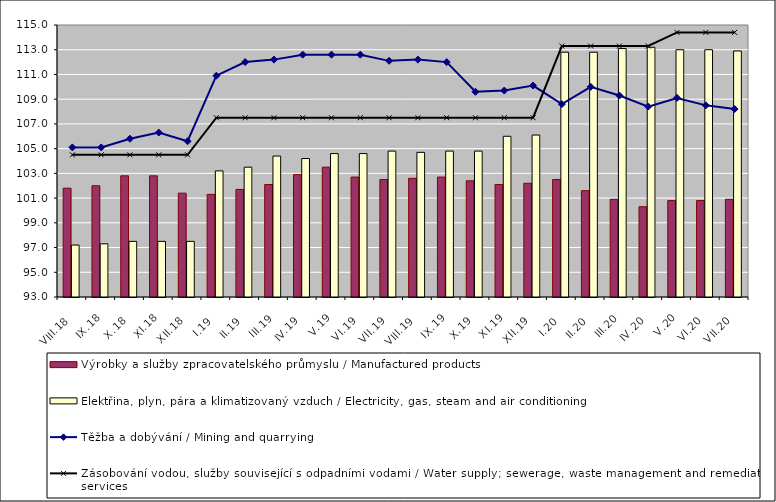
| Category | Výrobky a služby zpracovatelského průmyslu / Manufactured products | Elektřina, plyn, pára a klimatizovaný vzduch / Electricity, gas, steam and air conditioning |
|---|---|---|
| VIII.18 | 101.8 | 97.2 |
| IX.18 | 102 | 97.3 |
| X.18 | 102.8 | 97.5 |
| XI.18 | 102.8 | 97.5 |
| XII.18 | 101.4 | 97.5 |
| I.19 | 101.3 | 103.2 |
| II.19 | 101.7 | 103.5 |
| III.19 | 102.1 | 104.4 |
| IV.19 | 102.9 | 104.2 |
| V.19 | 103.5 | 104.6 |
| VI.19 | 102.7 | 104.6 |
| VII.19 | 102.5 | 104.8 |
| VIII.19 | 102.6 | 104.7 |
| IX.19 | 102.7 | 104.8 |
| X.19 | 102.4 | 104.8 |
| XI.19 | 102.1 | 106 |
| XII.19 | 102.2 | 106.1 |
| I.20 | 102.5 | 112.8 |
| II.20 | 101.6 | 112.8 |
| III.20 | 100.9 | 113.1 |
| IV.20 | 100.3 | 113.2 |
| V.20 | 100.8 | 113 |
| VI.20 | 100.8 | 113 |
| VII.20 | 100.9 | 112.9 |